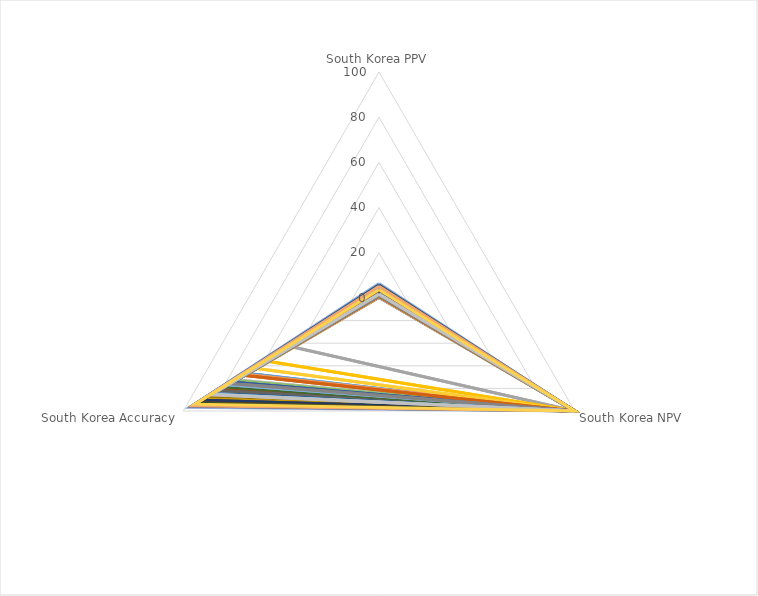
| Category | Series 0 | Series 1 | Series 2 | Series 3 | Series 4 | Series 5 | Series 6 | Series 7 | Series 8 | Series 9 | Series 10 | Series 11 | Series 12 | Series 13 | Series 14 | Series 15 | Series 16 | Series 17 | Series 18 | Series 19 | Series 20 | Series 21 | Series 22 | Series 23 | Series 24 | Series 25 | Series 26 | Series 27 | Series 28 | Series 29 | Series 30 | Series 31 | Series 32 | Series 33 | Series 34 | Series 35 | Series 36 | Series 37 | Series 38 | Series 39 |
|---|---|---|---|---|---|---|---|---|---|---|---|---|---|---|---|---|---|---|---|---|---|---|---|---|---|---|---|---|---|---|---|---|---|---|---|---|---|---|---|---|
| South Korea PPV | 0.23 | 0.36 | 0.46 | 0.55 | 0.73 | 1.14 | 1.05 | 1.25 | 1.34 | 1.57 | 1.54 | 1.06 | 0.66 | 0.6 | 0.68 | 0.61 | 0.83 | 0.9 | 0.87 | 0.67 | 1.06 | 1.71 | 2.95 | 3.24 | 6.43 | 2.99 | 3.37 | 3.83 | 1.72 | 2.92 | 2.79 | 3.54 | 4.42 | 3.99 | 5.72 | 3.81 | 4.87 | 5.22 | 1.84 | 3.66 |
| South Korea NPV | 99.72 | 99.75 | 99.96 | 99.93 | 99.95 | 99.96 | 99.98 | 99.95 | 99.96 | 99.92 | 99.96 | 99.94 | 99.9 | 99.88 | 99.88 | 99.93 | 99.89 | 99.95 | 99.93 | 99.91 | 99.98 | 99.9 | 99.95 | 99.97 | 99.94 | 99.98 | 99.98 | 99.99 | 99.98 | 99.99 | 99.99 | 99.99 | 100 | 100 | 99.99 | 100 | 100 | 99.98 | 99.99 | 99.95 |
| South Korea Accuracy | 91.81 | 75.68 | 43.52 | 56.18 | 66.91 | 78.92 | 75.29 | 80.94 | 81.8 | 87 | 84.41 | 78.45 | 68.02 | 67.79 | 72.6 | 62.37 | 76.85 | 73.15 | 74.62 | 68.58 | 75.77 | 89.32 | 92.37 | 92.53 | 96.72 | 91.69 | 92.58 | 93.26 | 85.07 | 91.1 | 90.57 | 92.69 | 94.01 | 93.34 | 95.53 | 93.09 | 94.65 | 95.34 | 85.58 | 93.96 |